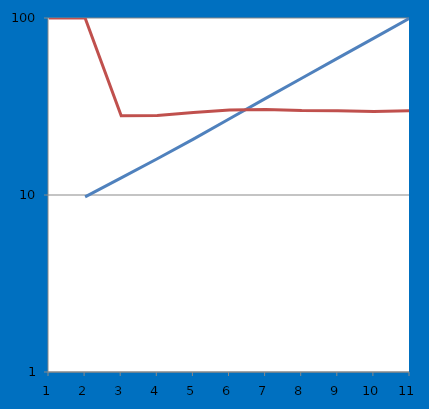
| Category | Series 0 | Series 1 |
|---|---|---|
| 0 | 0 | 100 |
| 1 | 9.766 | 100 |
| 2 | 12.5 | 28 |
| 3 | 16.016 | 28.125 |
| 4 | 20.703 | 29.268 |
| 5 | 26.953 | 30.189 |
| 6 | 35.156 | 30.435 |
| 7 | 45.703 | 30 |
| 8 | 59.375 | 29.915 |
| 9 | 76.953 | 29.605 |
| 10 | 100 | 29.949 |